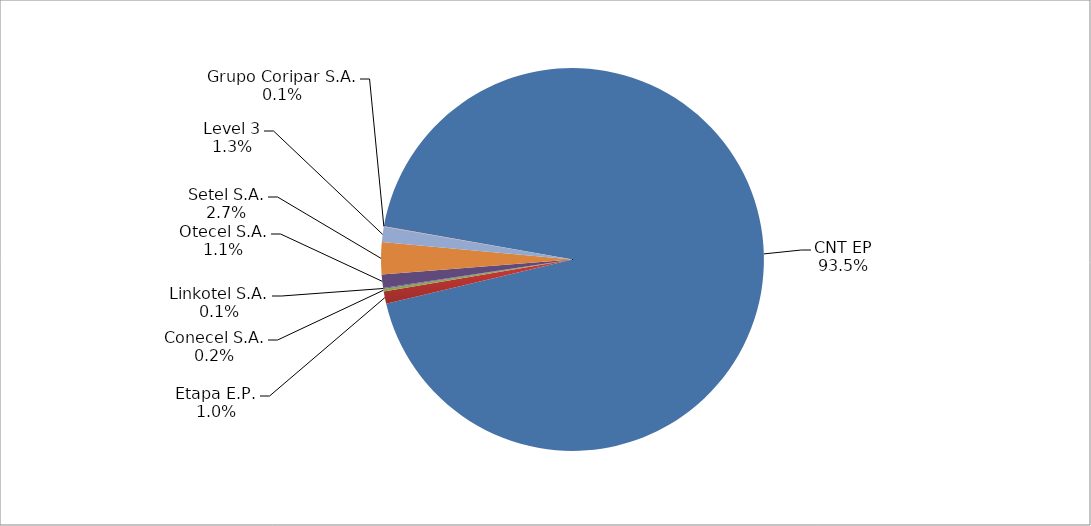
| Category | Series 0 |
|---|---|
| CNT EP | 2249 |
| Etapa E.P. | 25 |
| Conecel S.A. | 5 |
| Linkotel S.A. | 2 |
| Otecel S.A. | 27 |
| Setel S.A. | 65 |
| Level 3 | 31 |
| Grupo Coripar S.A. | 1 |